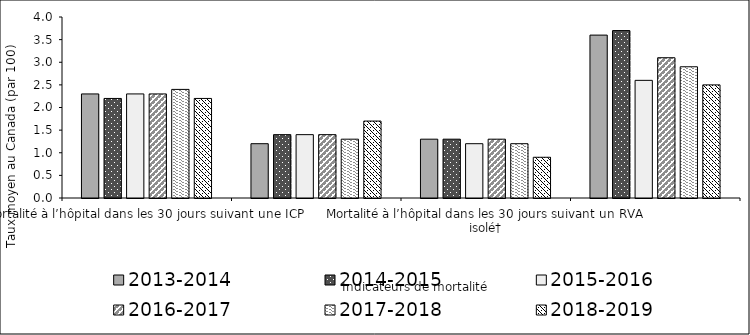
| Category | 2013-2014 | 2014-2015 | 2015-2016 | 2016-2017 | 2017-2018 | 2018-2019 |
|---|---|---|---|---|---|---|
| Mortalité à l’hôpital dans les 30 jours suivant une ICP | 2.3 | 2.2 | 2.3 | 2.3 | 2.4 | 2.2 |
| Mortalité à l’hôpital dans les 30 jours suivant un PAC isolé† | 1.2 | 1.4 | 1.4 | 1.4 | 1.3 | 1.7 |
| Mortalité à l’hôpital dans les 30 jours suivant un RVA isolé† | 1.3 | 1.3 | 1.2 | 1.3 | 1.2 | 0.9 |
| Mortalité à l’hôpital dans les 30 jours suivant un PAC et un RVA | 3.6 | 3.7 | 2.6 | 3.1 | 2.9 | 2.5 |